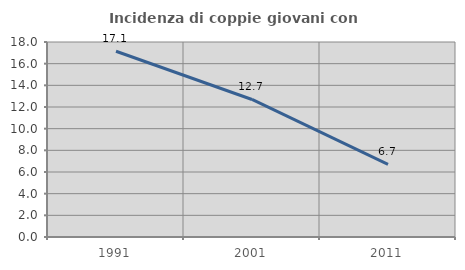
| Category | Incidenza di coppie giovani con figli |
|---|---|
| 1991.0 | 17.143 |
| 2001.0 | 12.695 |
| 2011.0 | 6.709 |